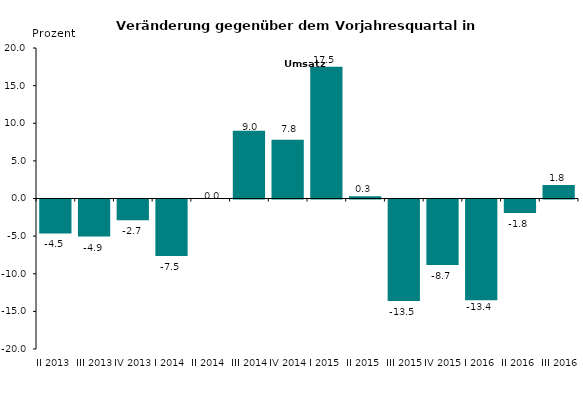
| Category | -4,9 -2,7 -7,5 0,0 9,0 7,8 17,5 0,3 -13,5 -8,7 -13,4 -1,8 1,8 4,8 |
|---|---|
| II 2013 | -4.513 |
| III 2013 | -4.922 |
| IV 2013 | -2.749 |
| I 2014 | -7.5 |
| II 2014 | 0 |
| III 2014 | 9 |
| IV 2014 | 7.8 |
| I 2015 | 17.5 |
| II 2015 | 0.3 |
| III 2015 | -13.5 |
| IV 2015 | -8.7 |
| I 2016 | -13.4 |
| II 2016 | -1.8 |
| III 2016 | 1.8 |